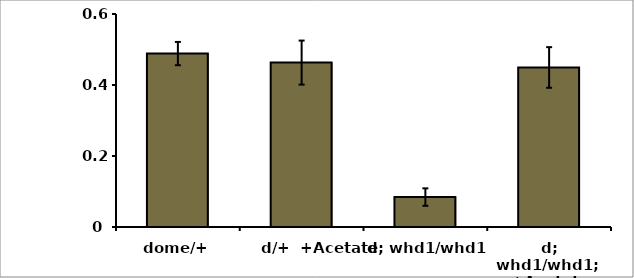
| Category | Series 0 |
|---|---|
| dome/+ | 0.488 |
| d/+  +Acetate | 0.463 |
| d; whd1/whd1 | 0.084 |
| d; whd1/whd1;  +Acetate | 0.449 |